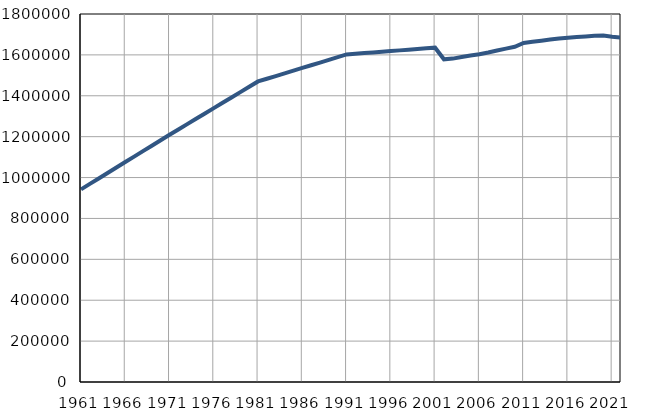
| Category | Population
size |
|---|---|
| 1961.0 | 942190 |
| 1962.0 | 968907 |
| 1963.0 | 995625 |
| 1964.0 | 1022342 |
| 1965.0 | 1049059 |
| 1966.0 | 1075775 |
| 1967.0 | 1102492 |
| 1968.0 | 1129209 |
| 1969.0 | 1155926 |
| 1970.0 | 1182643 |
| 1971.0 | 1209360 |
| 1972.0 | 1235431 |
| 1973.0 | 1261503 |
| 1974.0 | 1287574 |
| 1975.0 | 1313645 |
| 1976.0 | 1339719 |
| 1977.0 | 1365788 |
| 1978.0 | 1391859 |
| 1979.0 | 1417930 |
| 1980.0 | 1444002 |
| 1981.0 | 1470073 |
| 1982.0 | 1483288 |
| 1983.0 | 1496504 |
| 1984.0 | 1509719 |
| 1985.0 | 1522934 |
| 1986.0 | 1536150 |
| 1987.0 | 1549365 |
| 1988.0 | 1562580 |
| 1989.0 | 1575795 |
| 1990.0 | 1589011 |
| 1991.0 | 1602226 |
| 1992.0 | 1605537 |
| 1993.0 | 1608847 |
| 1994.0 | 1612158 |
| 1995.0 | 1615469 |
| 1996.0 | 1618779 |
| 1997.0 | 1622091 |
| 1998.0 | 1625400 |
| 1999.0 | 1628711 |
| 2000.0 | 1632022 |
| 2001.0 | 1635333 |
| 2002.0 | 1578364 |
| 2003.0 | 1581844 |
| 2004.0 | 1589260 |
| 2005.0 | 1596919 |
| 2006.0 | 1602861 |
| 2007.0 | 1611333 |
| 2008.0 | 1621396 |
| 2009.0 | 1630582 |
| 2010.0 | 1639505 |
| 2011.0 | 1658151 |
| 2012.0 | 1664218 |
| 2013.0 | 1669552 |
| 2014.0 | 1675043 |
| 2015.0 | 1679895 |
| 2016.0 | 1683962 |
| 2017.0 | 1687132 |
| 2018.0 | 1690193 |
| 2019.0 | 1694056 |
| 2020.0 | 1694480 |
| 2021.0 | 1688667 |
| 2022.0 | 1684259 |